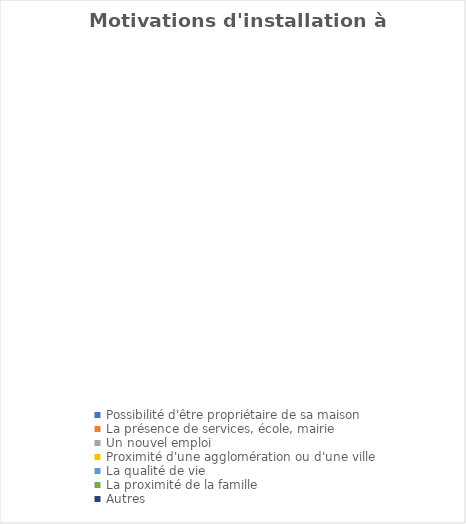
| Category | Series 0 |
|---|---|
| Possibilité d'être propriétaire de sa maison | 0 |
| La présence de services, école, mairie | 0 |
| Un nouvel emploi | 0 |
| Proximité d'une agglomération ou d'une ville | 0 |
| La qualité de vie | 0 |
| La proximité de la famille  | 0 |
| Autres | 0 |